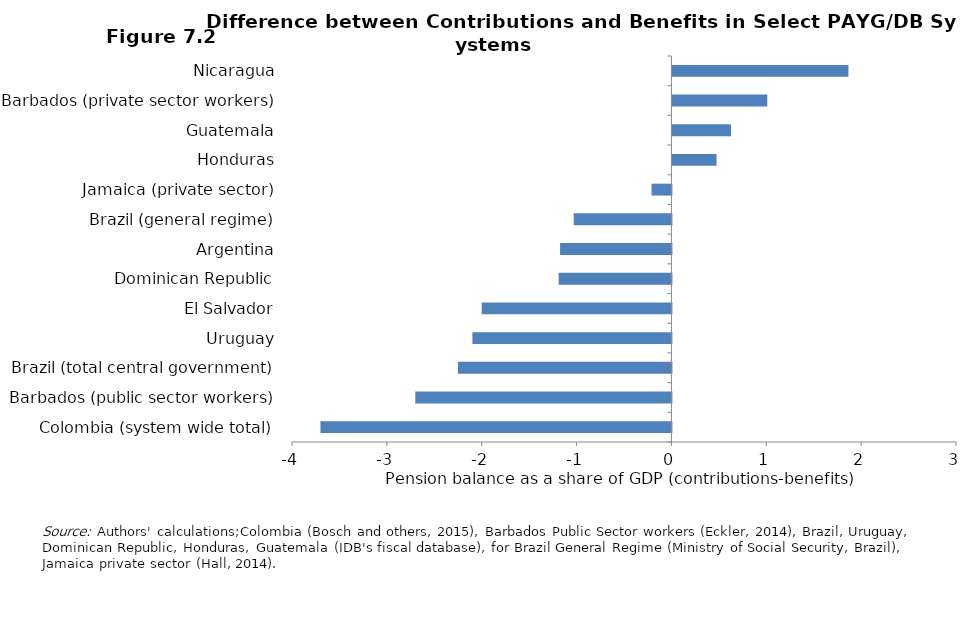
| Category | Series 0 |
|---|---|
| Colombia (system wide total) | -3.7 |
| Barbados (public sector workers) | -2.7 |
| Brazil (total central government) | -2.25 |
| Uruguay | -2.098 |
| El Salvador | -2 |
| Dominican Republic | -1.189 |
| Argentina | -1.174 |
| Brazil (general regime) | -1.03 |
| Jamaica (private sector) | -0.21 |
| Honduras | 0.465 |
| Guatemala | 0.618 |
| Barbados (private sector workers) | 1 |
| Nicaragua | 1.856 |